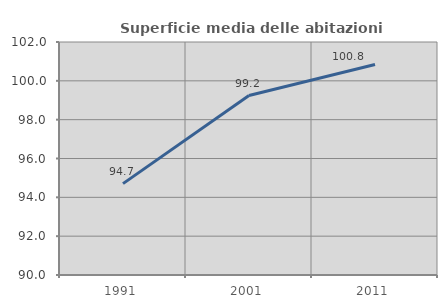
| Category | Superficie media delle abitazioni occupate |
|---|---|
| 1991.0 | 94.705 |
| 2001.0 | 99.242 |
| 2011.0 | 100.845 |